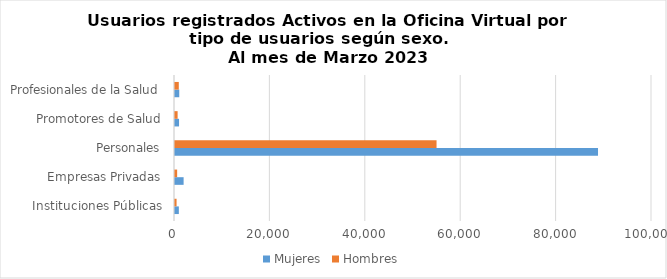
| Category | Mujeres | Hombres |
|---|---|---|
| Instituciones Públicas | 805 | 329 |
| Empresas Privadas | 1805 | 450 |
| Personales | 88682 | 54831 |
| Promotores de Salud | 849 | 548 |
| Profesionales de la Salud | 893 | 795 |